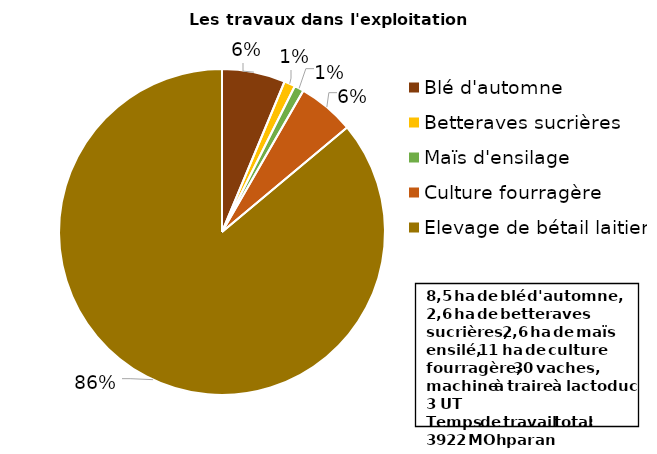
| Category | Series 0 |
|---|---|
| Blé d'automne | 246 |
| Betteraves sucrières | 43 |
| Maïs d'ensilage | 37 |
| Culture fourragère | 220 |
| Elevage de bétail laitier | 3376 |